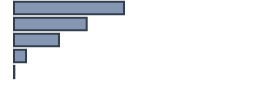
| Category | Percentatge |
|---|---|
| 0 | 45.838 |
| 1 | 30.286 |
| 2 | 18.74 |
| 3 | 4.995 |
| 4 | 0.141 |